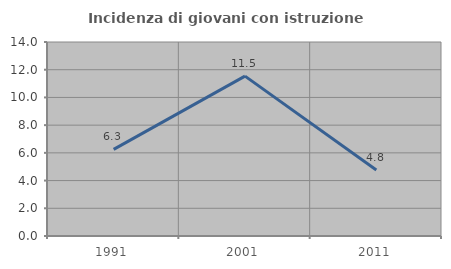
| Category | Incidenza di giovani con istruzione universitaria |
|---|---|
| 1991.0 | 6.25 |
| 2001.0 | 11.538 |
| 2011.0 | 4.762 |